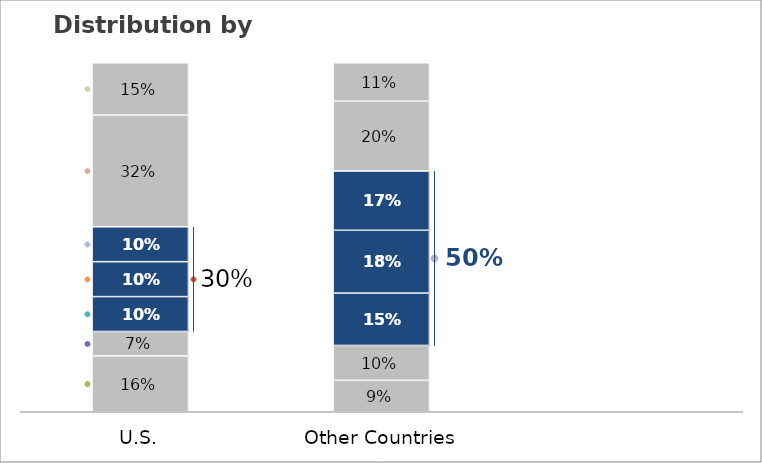
| Category | Segment 1 | Segment 2 | Segment 3 | Segment 4 | Segment 5 | Segment 6 | Segment 7 |
|---|---|---|---|---|---|---|---|
| U.S. | 0.16 | 0.07 | 0.1 | 0.1 | 0.1 | 0.32 | 0.15 |
| Other Countries | 0.09 | 0.1 | 0.15 | 0.18 | 0.17 | 0.2 | 0.11 |